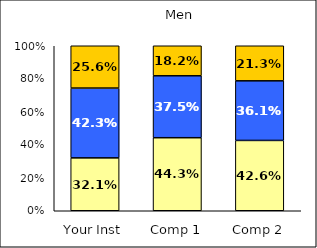
| Category | Low Likelihood of College Involvement | Average Likelihood of College Involvement | High Likelihood of College Involvement |
|---|---|---|---|
| Your Inst | 0.321 | 0.423 | 0.256 |
| Comp 1 | 0.443 | 0.375 | 0.182 |
| Comp 2 | 0.426 | 0.361 | 0.213 |